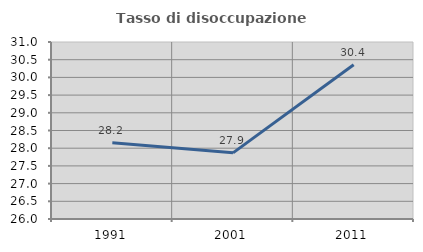
| Category | Tasso di disoccupazione giovanile  |
|---|---|
| 1991.0 | 28.155 |
| 2001.0 | 27.869 |
| 2011.0 | 30.357 |